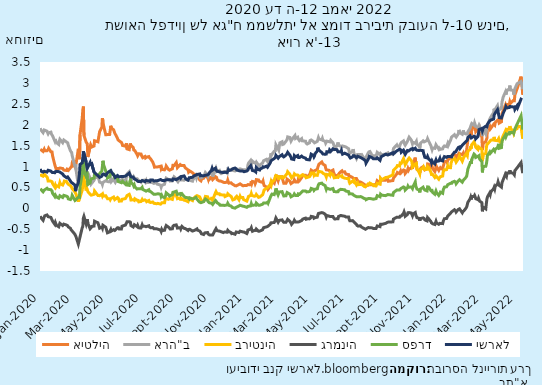
| Category | איטליה | ארה"ב | בריטניה | גרמניה | ספרד | ישראל |
|---|---|---|---|---|---|---|
| 2020-01-01 02:00:00 | 1.412 | 1.918 | 0.822 | -0.186 | 0.468 | 0.943 |
| 2020-01-02 02:00:00 | 1.413 | 1.877 | 0.793 | -0.223 | 0.445 | 0.894 |
| 2020-01-06 02:00:00 | 1.361 | 1.809 | 0.768 | -0.287 | 0.394 | 0.865 |
| 2020-01-07 02:00:00 | 1.377 | 1.818 | 0.792 | -0.285 | 0.397 | 0.881 |
| 2020-01-08 02:00:00 | 1.414 | 1.874 | 0.817 | -0.207 | 0.433 | 0.885 |
| 2020-01-09 02:00:00 | 1.378 | 1.854 | 0.82 | -0.179 | 0.451 | 0.883 |
| 2020-01-13 02:00:00 | 1.376 | 1.846 | 0.75 | -0.159 | 0.479 | 0.866 |
| 2020-01-14 02:00:00 | 1.395 | 1.811 | 0.72 | -0.171 | 0.479 | 0.876 |
| 2020-01-15 02:00:00 | 1.4 | 1.783 | 0.654 | -0.2 | 0.454 | 0.91 |
| 2020-01-16 02:00:00 | 1.436 | 1.807 | 0.643 | -0.219 | 0.467 | 0.929 |
| 2020-01-20 02:00:00 | 1.353 | 1.822 | 0.65 | -0.218 | 0.445 | 0.89 |
| 2020-01-21 02:00:00 | 1.371 | 1.774 | 0.631 | -0.248 | 0.423 | 0.869 |
| 2020-01-22 02:00:00 | 1.348 | 1.769 | 0.635 | -0.26 | 0.413 | 0.859 |
| 2020-01-23 02:00:00 | 1.254 | 1.732 | 0.591 | -0.308 | 0.358 | 0.867 |
| 2020-01-27 02:00:00 | 1.037 | 1.608 | 0.508 | -0.385 | 0.281 | 0.851 |
| 2020-01-28 02:00:00 | 1.032 | 1.656 | 0.552 | -0.341 | 0.315 | 0.876 |
| 2020-01-29 02:00:00 | 0.953 | 1.584 | 0.516 | -0.377 | 0.3 | 0.889 |
| 2020-01-30 02:00:00 | 0.942 | 1.586 | 0.542 | -0.406 | 0.271 | 0.884 |
| 2020-02-03 02:00:00 | 0.951 | 1.527 | 0.513 | -0.442 | 0.242 | 0.877 |
| 2020-02-04 02:00:00 | 0.951 | 1.599 | 0.566 | -0.399 | 0.269 | 0.872 |
| 2020-02-05 02:00:00 | 0.964 | 1.651 | 0.616 | -0.359 | 0.3 | 0.866 |
| 2020-02-06 02:00:00 | 0.964 | 1.642 | 0.582 | -0.37 | 0.295 | 0.847 |
| 2020-02-10 02:00:00 | 0.952 | 1.57 | 0.557 | -0.411 | 0.259 | 0.82 |
| 2020-02-11 02:00:00 | 0.969 | 1.601 | 0.569 | -0.391 | 0.268 | 0.797 |
| 2020-02-12 02:00:00 | 0.914 | 1.633 | 0.611 | -0.378 | 0.31 | 0.781 |
| 2020-02-13 02:00:00 | 0.907 | 1.617 | 0.652 | -0.386 | 0.299 | 0.77 |
| 2020-02-17 02:00:00 | 0.905 | 1.585 | 0.641 | -0.401 | 0.289 | 0.733 |
| 2020-02-18 02:00:00 | 0.931 | 1.561 | 0.611 | -0.407 | 0.288 | 0.749 |
| 2020-02-19 02:00:00 | 0.953 | 1.566 | 0.599 | -0.418 | 0.271 | 0.75 |
| 2020-02-20 02:00:00 | 0.906 | 1.515 | 0.576 | -0.444 | 0.226 | 0.74 |
| 2020-02-24 02:00:00 | 0.968 | 1.37 | 0.54 | -0.481 | 0.209 | 0.651 |
| 2020-02-25 02:00:00 | 0.988 | 1.352 | 0.519 | -0.512 | 0.213 | 0.627 |
| 2020-02-26 02:00:00 | 0.994 | 1.337 | 0.504 | -0.505 | 0.25 | 0.643 |
| 2020-02-27 02:00:00 | 1.075 | 1.261 | 0.47 | -0.543 | 0.31 | 0.606 |
| 2020-03-03 02:00:00 | 0.989 | 0.999 | 0.39 | -0.625 | 0.188 | 0.554 |
| 2020-03-04 02:00:00 | 1.014 | 1.052 | 0.369 | -0.638 | 0.176 | 0.41 |
| 2020-03-05 02:00:00 | 1.068 | 0.912 | 0.331 | -0.686 | 0.213 | 0.483 |
| 2020-03-09 02:00:00 | 1.424 | 0.541 | 0.159 | -0.856 | 0.264 | 0.615 |
| 2020-03-11 02:00:00 | 1.176 | 0.87 | 0.296 | -0.742 | 0.262 | 0.817 |
| 2020-03-12 02:00:00 | 1.76 | 0.804 | 0.265 | -0.741 | 0.514 | 1.048 |
| 2020-03-16 02:00:00 | 2.165 | 0.718 | 0.438 | -0.461 | 0.841 | 1.088 |
| 2020-03-17 02:00:00 | 2.355 | 1.078 | 0.554 | -0.434 | 1.033 | 1.204 |
| 2020-03-18 02:00:00 | 2.434 | 1.192 | 0.796 | -0.235 | 1.221 | 1.365 |
| 2020-03-19 02:00:00 | 1.741 | 1.14 | 0.724 | -0.193 | 0.879 | 1.341 |
| 2020-03-23 02:00:00 | 1.581 | 0.786 | 0.425 | -0.375 | 0.759 | 1.105 |
| 2020-03-24 02:00:00 | 1.565 | 0.847 | 0.479 | -0.322 | 0.881 | 1.018 |
| 2020-03-25 02:00:00 | 1.543 | 0.867 | 0.445 | -0.262 | 0.873 | 0.957 |
| 2020-03-26 02:00:00 | 1.226 | 0.845 | 0.399 | -0.361 | 0.569 | 0.959 |
| 2020-03-30 03:00:00 | 1.478 | 0.726 | 0.336 | -0.49 | 0.606 | 1.09 |
| 2020-03-31 03:00:00 | 1.523 | 0.67 | 0.356 | -0.471 | 0.677 | 1.019 |
| 2020-04-01 03:00:00 | 1.509 | 0.583 | 0.314 | -0.458 | 0.703 | 1.106 |
| 2020-04-02 03:00:00 | 1.467 | 0.597 | 0.333 | -0.433 | 0.708 | 1.089 |
| 2020-04-06 03:00:00 | 1.49 | 0.67 | 0.334 | -0.425 | 0.723 | 0.867 |
| 2020-04-07 03:00:00 | 1.616 | 0.712 | 0.414 | -0.309 | 0.818 | 0.863 |
| 2020-04-13 03:00:00 | 1.591 | 0.771 | 0.306 | -0.347 | 0.782 | 0.779 |
| 2020-04-16 03:00:00 | 1.833 | 0.627 | 0.302 | -0.474 | 0.83 | 0.739 |
| 2020-04-20 03:00:00 | 1.939 | 0.605 | 0.337 | -0.448 | 0.891 | 0.768 |
| 2020-04-21 03:00:00 | 2.156 | 0.569 | 0.297 | -0.477 | 1.004 | 0.806 |
| 2020-04-22 03:00:00 | 2.079 | 0.619 | 0.327 | -0.407 | 1.137 | 0.817 |
| 2020-04-23 03:00:00 | 1.986 | 0.602 | 0.292 | -0.424 | 1.049 | 0.818 |
| 2020-04-27 03:00:00 | 1.76 | 0.66 | 0.301 | -0.453 | 0.889 | 0.789 |
| 2020-04-30 03:00:00 | 1.763 | 0.639 | 0.231 | -0.586 | 0.723 | 0.848 |
| 2020-05-04 03:00:00 | 1.767 | 0.634 | 0.231 | -0.563 | 0.759 | 0.887 |
| 2020-05-05 03:00:00 | 1.867 | 0.662 | 0.206 | -0.578 | 0.781 | 0.878 |
| 2020-05-06 03:00:00 | 1.975 | 0.703 | 0.231 | -0.507 | 0.853 | 0.903 |
| 2020-05-07 03:00:00 | 1.919 | 0.641 | 0.235 | -0.545 | 0.821 | 0.872 |
| 2020-05-11 03:00:00 | 1.879 | 0.71 | 0.269 | -0.512 | 0.814 | 0.8 |
| 2020-05-12 03:00:00 | 1.89 | 0.665 | 0.249 | -0.505 | 0.788 | 0.792 |
| 2020-05-13 03:00:00 | 1.802 | 0.652 | 0.208 | -0.53 | 0.735 | 0.763 |
| 2020-05-14 03:00:00 | 1.817 | 0.622 | 0.204 | -0.543 | 0.747 | 0.738 |
| 2020-05-18 03:00:00 | 1.673 | 0.726 | 0.257 | -0.467 | 0.733 | 0.784 |
| 2020-05-19 03:00:00 | 1.635 | 0.688 | 0.245 | -0.464 | 0.642 | 0.783 |
| 2020-05-20 03:00:00 | 1.633 | 0.68 | 0.229 | -0.468 | 0.64 | 0.753 |
| 2020-05-21 03:00:00 | 1.614 | 0.672 | 0.171 | -0.495 | 0.633 | 0.76 |
| 2020-05-25 03:00:00 | 1.575 | 0.659 | 0.174 | -0.494 | 0.612 | 0.761 |
| 2020-05-26 03:00:00 | 1.55 | 0.696 | 0.215 | -0.429 | 0.626 | 0.748 |
| 2020-05-27 03:00:00 | 1.502 | 0.682 | 0.193 | -0.414 | 0.646 | 0.757 |
| 2020-06-01 03:00:00 | 1.487 | 0.659 | 0.231 | -0.402 | 0.577 | 0.77 |
| 2020-06-02 03:00:00 | 1.501 | 0.685 | 0.222 | -0.415 | 0.558 | 0.775 |
| 2020-06-03 03:00:00 | 1.554 | 0.746 | 0.274 | -0.354 | 0.61 | 0.788 |
| 2020-06-04 03:00:00 | 1.421 | 0.823 | 0.306 | -0.32 | 0.556 | 0.801 |
| 2020-06-08 03:00:00 | 1.404 | 0.875 | 0.334 | -0.319 | 0.548 | 0.842 |
| 2020-06-09 03:00:00 | 1.501 | 0.825 | 0.336 | -0.309 | 0.637 | 0.813 |
| 2020-06-10 03:00:00 | 1.551 | 0.726 | 0.267 | -0.331 | 0.677 | 0.795 |
| 2020-06-11 03:00:00 | 1.499 | 0.669 | 0.198 | -0.414 | 0.628 | 0.752 |
| 2020-06-15 03:00:00 | 1.458 | 0.722 | 0.205 | -0.446 | 0.561 | 0.747 |
| 2020-06-16 03:00:00 | 1.397 | 0.753 | 0.207 | -0.427 | 0.533 | 0.734 |
| 2020-06-17 03:00:00 | 1.416 | 0.738 | 0.19 | -0.392 | 0.559 | 0.706 |
| 2020-06-18 03:00:00 | 1.379 | 0.708 | 0.228 | -0.407 | 0.516 | 0.694 |
| 2020-06-22 03:00:00 | 1.288 | 0.708 | 0.193 | -0.439 | 0.461 | 0.665 |
| 2020-06-23 03:00:00 | 1.256 | 0.712 | 0.211 | -0.408 | 0.476 | 0.658 |
| 2020-06-24 03:00:00 | 1.267 | 0.679 | 0.189 | -0.44 | 0.469 | 0.639 |
| 2020-06-25 03:00:00 | 1.305 | 0.686 | 0.154 | -0.468 | 0.458 | 0.643 |
| 2020-06-29 03:00:00 | 1.298 | 0.623 | 0.163 | -0.47 | 0.47 | 0.64 |
| 2020-06-30 03:00:00 | 1.258 | 0.656 | 0.172 | -0.454 | 0.467 | 0.645 |
| 2020-07-01 03:00:00 | 1.271 | 0.676 | 0.211 | -0.395 | 0.502 | 0.664 |
| 2020-07-02 03:00:00 | 1.211 | 0.669 | 0.186 | -0.428 | 0.452 | 0.648 |
| 2020-07-06 03:00:00 | 1.24 | 0.676 | 0.201 | -0.431 | 0.425 | 0.637 |
| 2020-07-07 03:00:00 | 1.204 | 0.64 | 0.18 | -0.429 | 0.425 | 0.627 |
| 2020-07-08 03:00:00 | 1.202 | 0.664 | 0.183 | -0.44 | 0.41 | 0.666 |
| 2020-07-09 03:00:00 | 1.224 | 0.614 | 0.158 | -0.463 | 0.408 | 0.657 |
| 2020-07-13 03:00:00 | 1.237 | 0.618 | 0.186 | -0.417 | 0.444 | 0.656 |
| 2020-07-14 03:00:00 | 1.212 | 0.623 | 0.15 | -0.447 | 0.408 | 0.647 |
| 2020-07-15 03:00:00 | 1.201 | 0.63 | 0.166 | -0.444 | 0.422 | 0.644 |
| 2020-07-16 03:00:00 | 1.187 | 0.617 | 0.139 | -0.465 | 0.401 | 0.677 |
| 2020-07-20 03:00:00 | 1.104 | 0.61 | 0.151 | -0.46 | 0.356 | 0.678 |
| 2020-07-21 03:00:00 | 1.094 | 0.6 | 0.136 | -0.46 | 0.356 | 0.674 |
| 2020-07-22 03:00:00 | 1.036 | 0.597 | 0.12 | -0.49 | 0.334 | 0.653 |
| 2020-07-23 03:00:00 | 0.984 | 0.577 | 0.124 | -0.481 | 0.323 | 0.667 |
| 2020-07-27 03:00:00 | 0.988 | 0.615 | 0.109 | -0.491 | 0.34 | 0.662 |
| 2020-07-28 03:00:00 | 1.007 | 0.579 | 0.109 | -0.508 | 0.356 | 0.662 |
| 2020-07-29 03:00:00 | 0.992 | 0.574 | 0.118 | -0.498 | 0.348 | 0.662 |
| 2020-08-03 03:00:00 | 1.007 | 0.554 | 0.099 | -0.523 | 0.336 | 0.688 |
| 2020-08-04 03:00:00 | 0.947 | 0.507 | 0.077 | -0.553 | 0.283 | 0.688 |
| 2020-08-05 03:00:00 | 0.972 | 0.548 | 0.13 | -0.506 | 0.309 | 0.669 |
| 2020-08-06 03:00:00 | 0.931 | 0.536 | 0.108 | -0.531 | 0.279 | 0.67 |
| 2020-08-10 03:00:00 | 0.92 | 0.576 | 0.131 | -0.526 | 0.255 | 0.66 |
| 2020-08-11 03:00:00 | 0.943 | 0.642 | 0.2 | -0.478 | 0.279 | 0.672 |
| 2020-08-12 03:00:00 | 0.961 | 0.675 | 0.237 | -0.447 | 0.303 | 0.68 |
| 2020-08-13 03:00:00 | 1.011 | 0.721 | 0.243 | -0.412 | 0.37 | 0.662 |
| 2020-08-17 03:00:00 | 0.93 | 0.688 | 0.216 | -0.451 | 0.326 | 0.681 |
| 2020-08-18 03:00:00 | 0.926 | 0.669 | 0.219 | -0.463 | 0.31 | 0.685 |
| 2020-08-19 03:00:00 | 0.913 | 0.68 | 0.236 | -0.472 | 0.292 | 0.685 |
| 2020-08-20 03:00:00 | 0.914 | 0.651 | 0.225 | -0.496 | 0.291 | 0.688 |
| 2020-08-24 03:00:00 | 0.944 | 0.654 | 0.213 | -0.491 | 0.327 | 0.669 |
| 2020-08-25 03:00:00 | 1.026 | 0.684 | 0.263 | -0.431 | 0.382 | 0.702 |
| 2020-08-26 03:00:00 | 1.017 | 0.688 | 0.302 | -0.415 | 0.376 | 0.713 |
| 2020-08-27 03:00:00 | 1.02 | 0.752 | 0.336 | -0.407 | 0.389 | 0.7 |
| 2020-08-31 03:00:00 | 1.094 | 0.705 | 0.311 | -0.397 | 0.409 | 0.685 |
| 2020-09-01 03:00:00 | 1.035 | 0.669 | 0.295 | -0.42 | 0.398 | 0.691 |
| 2020-09-02 03:00:00 | 0.972 | 0.648 | 0.23 | -0.473 | 0.331 | 0.701 |
| 2020-09-03 03:00:00 | 0.975 | 0.635 | 0.237 | -0.488 | 0.326 | 0.722 |
| 2020-09-07 03:00:00 | 1.046 | 0.718 | 0.248 | -0.463 | 0.352 | 0.748 |
| 2020-09-08 03:00:00 | 1.028 | 0.679 | 0.188 | -0.495 | 0.326 | 0.723 |
| 2020-09-09 03:00:00 | 1.021 | 0.7 | 0.237 | -0.462 | 0.339 | 0.731 |
| 2020-09-10 03:00:00 | 1.008 | 0.677 | 0.227 | -0.433 | 0.35 | 0.763 |
| 2020-09-14 03:00:00 | 1.021 | 0.672 | 0.194 | -0.48 | 0.283 | 0.775 |
| 2020-09-15 03:00:00 | 0.998 | 0.679 | 0.217 | -0.479 | 0.271 | 0.767 |
| 2020-09-16 03:00:00 | 0.969 | 0.697 | 0.211 | -0.484 | 0.261 | 0.727 |
| 2020-09-17 03:00:00 | 0.954 | 0.689 | 0.185 | -0.491 | 0.264 | 0.702 |
| 2020-09-21 03:00:00 | 0.918 | 0.666 | 0.157 | -0.53 | 0.253 | 0.674 |
| 2020-09-22 03:00:00 | 0.866 | 0.671 | 0.203 | -0.505 | 0.235 | 0.691 |
| 2020-09-23 03:00:00 | 0.851 | 0.672 | 0.218 | -0.505 | 0.225 | 0.73 |
| 2020-09-24 03:00:00 | 0.894 | 0.666 | 0.219 | -0.501 | 0.251 | 0.746 |
| 2020-09-29 03:00:00 | 0.852 | 0.65 | 0.184 | -0.545 | 0.225 | 0.742 |
| 2020-09-30 03:00:00 | 0.866 | 0.684 | 0.229 | -0.522 | 0.248 | 0.757 |
| 2020-10-01 03:00:00 | 0.821 | 0.677 | 0.234 | -0.536 | 0.232 | 0.773 |
| 2020-10-05 03:00:00 | 0.808 | 0.782 | 0.288 | -0.51 | 0.261 | 0.793 |
| 2020-10-06 03:00:00 | 0.776 | 0.735 | 0.287 | -0.507 | 0.236 | 0.814 |
| 2020-10-07 03:00:00 | 0.785 | 0.787 | 0.303 | -0.493 | 0.242 | 0.809 |
| 2020-10-08 03:00:00 | 0.759 | 0.785 | 0.289 | -0.523 | 0.201 | 0.815 |
| 2020-10-12 03:00:00 | 0.677 | 0.774 | 0.271 | -0.545 | 0.145 | 0.821 |
| 2020-10-13 03:00:00 | 0.658 | 0.727 | 0.239 | -0.556 | 0.144 | 0.779 |
| 2020-10-14 03:00:00 | 0.657 | 0.726 | 0.22 | -0.581 | 0.135 | 0.788 |
| 2020-10-15 03:00:00 | 0.697 | 0.732 | 0.18 | -0.61 | 0.149 | 0.783 |
| 2020-10-19 03:00:00 | 0.72 | 0.769 | 0.169 | -0.628 | 0.159 | 0.775 |
| 2020-10-20 03:00:00 | 0.728 | 0.786 | 0.187 | -0.606 | 0.183 | 0.774 |
| 2020-10-21 03:00:00 | 0.782 | 0.823 | 0.242 | -0.588 | 0.204 | 0.787 |
| 2020-10-22 03:00:00 | 0.803 | 0.856 | 0.284 | -0.566 | 0.223 | 0.801 |
| 2020-10-26 02:00:00 | 0.739 | 0.801 | 0.275 | -0.58 | 0.186 | 0.8 |
| 2020-10-27 02:00:00 | 0.7 | 0.768 | 0.232 | -0.615 | 0.158 | 0.8 |
| 2020-10-28 02:00:00 | 0.765 | 0.771 | 0.213 | -0.625 | 0.178 | 0.821 |
| 2020-10-29 02:00:00 | 0.692 | 0.823 | 0.221 | -0.636 | 0.133 | 0.848 |
| 2020-11-02 02:00:00 | 0.748 | 0.843 | 0.219 | -0.64 | 0.121 | 0.914 |
| 2020-11-03 02:00:00 | 0.734 | 0.899 | 0.272 | -0.62 | 0.11 | 0.956 |
| 2020-11-04 02:00:00 | 0.687 | 0.763 | 0.207 | -0.638 | 0.092 | 0.916 |
| 2020-11-05 02:00:00 | 0.668 | 0.763 | 0.234 | -0.637 | 0.091 | 0.903 |
| 2020-11-09 02:00:00 | 0.757 | 0.924 | 0.372 | -0.509 | 0.186 | 0.961 |
| 2020-11-10 02:00:00 | 0.762 | 0.96 | 0.401 | -0.485 | 0.186 | 0.918 |
| 2020-11-11 02:00:00 | 0.738 | 0.975 | 0.413 | -0.507 | 0.157 | 0.911 |
| 2020-11-12 02:00:00 | 0.684 | 0.882 | 0.348 | -0.536 | 0.132 | 0.886 |
| 2020-11-16 02:00:00 | 0.652 | 0.906 | 0.349 | -0.545 | 0.099 | 0.875 |
| 2020-11-17 02:00:00 | 0.639 | 0.857 | 0.324 | -0.563 | 0.075 | 0.864 |
| 2020-11-18 02:00:00 | 0.655 | 0.87 | 0.337 | -0.554 | 0.081 | 0.867 |
| 2020-11-19 02:00:00 | 0.642 | 0.829 | 0.323 | -0.571 | 0.07 | 0.863 |
| 2020-11-23 02:00:00 | 0.624 | 0.854 | 0.318 | -0.581 | 0.071 | 0.855 |
| 2020-11-24 02:00:00 | 0.612 | 0.88 | 0.33 | -0.563 | 0.074 | 0.849 |
| 2020-11-25 02:00:00 | 0.615 | 0.882 | 0.318 | -0.568 | 0.069 | 0.86 |
| 2020-11-26 02:00:00 | 0.601 | 0.882 | 0.281 | -0.588 | 0.051 | 0.841 |
| 2020-11-30 02:00:00 | 0.626 | 0.839 | 0.305 | -0.571 | 0.081 | 0.859 |
| 2020-12-01 02:00:00 | 0.674 | 0.926 | 0.347 | -0.528 | 0.119 | 0.888 |
| 2020-12-02 02:00:00 | 0.632 | 0.936 | 0.354 | -0.519 | 0.103 | 0.927 |
| 2020-12-03 02:00:00 | 0.602 | 0.906 | 0.322 | -0.556 | 0.071 | 0.902 |
| 2020-12-07 02:00:00 | 0.61 | 0.923 | 0.283 | -0.582 | 0.052 | 0.917 |
| 2020-12-08 02:00:00 | 0.59 | 0.918 | 0.257 | -0.607 | 0.029 | 0.915 |
| 2020-12-09 02:00:00 | 0.582 | 0.936 | 0.261 | -0.605 | 0.021 | 0.94 |
| 2020-12-10 02:00:00 | 0.562 | 0.906 | 0.201 | -0.603 | 0.022 | 0.954 |
| 2020-12-14 02:00:00 | 0.541 | 0.893 | 0.222 | -0.62 | 0.003 | 0.964 |
| 2020-12-15 02:00:00 | 0.519 | 0.908 | 0.26 | -0.611 | -0.017 | 0.941 |
| 2020-12-16 02:00:00 | 0.536 | 0.916 | 0.272 | -0.567 | 0.023 | 0.947 |
| 2020-12-17 02:00:00 | 0.54 | 0.933 | 0.287 | -0.57 | 0.029 | 0.916 |
| 2020-12-21 02:00:00 | 0.569 | 0.935 | 0.205 | -0.58 | 0.056 | 0.899 |
| 2020-12-22 02:00:00 | 0.555 | 0.916 | 0.183 | -0.595 | 0.05 | 0.875 |
| 2020-12-23 02:00:00 | 0.585 | 0.943 | 0.286 | -0.547 | 0.074 | 0.893 |
| 2020-12-24 02:00:00 | 0.585 | 0.923 | 0.257 | -0.548 | 0.073 | 0.87 |
| 2020-12-28 02:00:00 | 0.539 | 0.923 | 0.257 | -0.565 | 0.05 | 0.89 |
| 2020-12-29 02:00:00 | 0.557 | 0.936 | 0.213 | -0.571 | 0.05 | 0.882 |
| 2020-12-30 02:00:00 | 0.543 | 0.923 | 0.213 | -0.569 | 0.047 | 0.876 |
| 2020-12-31 02:00:00 | 0.543 | 0.913 | 0.197 | -0.569 | 0.047 | 0.882 |
| 2021-01-04 02:00:00 | 0.548 | 0.913 | 0.173 | -0.604 | 0.023 | 0.892 |
| 2021-01-05 02:00:00 | 0.566 | 0.955 | 0.209 | -0.577 | 0.035 | 0.887 |
| 2021-01-06 02:00:00 | 0.567 | 1.036 | 0.243 | -0.52 | 0.046 | 0.915 |
| 2021-01-07 02:00:00 | 0.558 | 1.08 | 0.284 | -0.522 | 0.044 | 0.949 |
| 2021-01-11 02:00:00 | 0.564 | 1.146 | 0.309 | -0.496 | 0.058 | 1.019 |
| 2021-01-12 02:00:00 | 0.65 | 1.129 | 0.352 | -0.468 | 0.11 | 1.005 |
| 2021-01-13 02:00:00 | 0.6 | 1.083 | 0.307 | -0.522 | 0.069 | 0.949 |
| 2021-01-14 02:00:00 | 0.643 | 1.129 | 0.291 | -0.55 | 0.061 | 0.904 |
| 2021-01-18 02:00:00 | 0.631 | 1.084 | 0.287 | -0.527 | 0.078 | 0.892 |
| 2021-01-19 02:00:00 | 0.588 | 1.089 | 0.289 | -0.526 | 0.069 | 0.895 |
| 2021-01-20 02:00:00 | 0.619 | 1.08 | 0.301 | -0.529 | 0.075 | 0.87 |
| 2021-01-21 02:00:00 | 0.686 | 1.106 | 0.331 | -0.496 | 0.126 | 0.978 |
| 2021-01-25 02:00:00 | 0.678 | 1.03 | 0.262 | -0.55 | 0.073 | 0.924 |
| 2021-01-26 02:00:00 | 0.647 | 1.035 | 0.265 | -0.533 | 0.073 | 0.928 |
| 2021-01-27 02:00:00 | 0.655 | 1.016 | 0.269 | -0.546 | 0.074 | 0.915 |
| 2021-01-28 02:00:00 | 0.636 | 1.045 | 0.287 | -0.539 | 0.073 | 0.943 |
| 2021-02-01 02:00:00 | 0.621 | 1.079 | 0.321 | -0.516 | 0.095 | 0.968 |
| 2021-02-02 02:00:00 | 0.651 | 1.096 | 0.349 | -0.489 | 0.116 | 0.992 |
| 2021-02-03 02:00:00 | 0.587 | 1.137 | 0.371 | -0.464 | 0.127 | 0.996 |
| 2021-02-04 02:00:00 | 0.545 | 1.139 | 0.44 | -0.454 | 0.123 | 0.984 |
| 2021-02-08 02:00:00 | 0.508 | 1.17 | 0.475 | -0.445 | 0.127 | 1.007 |
| 2021-02-09 02:00:00 | 0.513 | 1.157 | 0.463 | -0.446 | 0.13 | 0.984 |
| 2021-02-10 02:00:00 | 0.504 | 1.122 | 0.489 | -0.437 | 0.147 | 0.982 |
| 2021-02-11 02:00:00 | 0.456 | 1.163 | 0.47 | -0.458 | 0.122 | 0.974 |
| 2021-02-15 02:00:00 | 0.527 | 1.208 | 0.571 | -0.381 | 0.26 | 1.09 |
| 2021-02-16 02:00:00 | 0.572 | 1.314 | 0.621 | -0.348 | 0.294 | 1.136 |
| 2021-02-17 02:00:00 | 0.586 | 1.27 | 0.572 | -0.368 | 0.288 | 1.116 |
| 2021-02-18 02:00:00 | 0.648 | 1.296 | 0.622 | -0.346 | 0.34 | 1.153 |
| 2021-02-22 02:00:00 | 0.597 | 1.365 | 0.679 | -0.339 | 0.327 | 1.191 |
| 2021-02-23 02:00:00 | 0.644 | 1.342 | 0.719 | -0.315 | 0.364 | 1.203 |
| 2021-02-24 02:00:00 | 0.687 | 1.376 | 0.732 | -0.304 | 0.391 | 1.215 |
| 2021-02-25 02:00:00 | 0.799 | 1.52 | 0.784 | -0.232 | 0.476 | 1.269 |
| 2021-03-01 02:00:00 | 0.658 | 1.417 | 0.759 | -0.334 | 0.324 | 1.201 |
| 2021-03-02 02:00:00 | 0.675 | 1.391 | 0.687 | -0.352 | 0.32 | 1.185 |
| 2021-03-03 02:00:00 | 0.755 | 1.481 | 0.779 | -0.288 | 0.39 | 1.237 |
| 2021-03-04 02:00:00 | 0.74 | 1.564 | 0.731 | -0.311 | 0.379 | 1.233 |
| 2021-03-08 02:00:00 | 0.756 | 1.591 | 0.754 | -0.277 | 0.399 | 1.281 |
| 2021-03-09 02:00:00 | 0.692 | 1.526 | 0.727 | -0.301 | 0.363 | 1.251 |
| 2021-03-10 02:00:00 | 0.675 | 1.518 | 0.714 | -0.313 | 0.352 | 1.234 |
| 2021-03-11 02:00:00 | 0.601 | 1.537 | 0.735 | -0.334 | 0.296 | 1.23 |
| 2021-03-15 02:00:00 | 0.599 | 1.606 | 0.798 | -0.334 | 0.299 | 1.272 |
| 2021-03-16 02:00:00 | 0.626 | 1.618 | 0.785 | -0.336 | 0.314 | 1.269 |
| 2021-03-17 02:00:00 | 0.697 | 1.643 | 0.83 | -0.291 | 0.377 | 1.31 |
| 2021-03-18 02:00:00 | 0.689 | 1.708 | 0.875 | -0.264 | 0.375 | 1.339 |
| 2021-03-22 02:00:00 | 0.647 | 1.695 | 0.814 | -0.311 | 0.338 | 1.271 |
| 2021-03-24 02:00:00 | 0.591 | 1.608 | 0.758 | -0.353 | 0.275 | 1.221 |
| 2021-03-25 02:00:00 | 0.58 | 1.633 | 0.729 | -0.384 | 0.262 | 1.18 |
| 2021-03-29 03:00:00 | 0.639 | 1.708 | 0.788 | -0.318 | 0.313 | 1.168 |
| 2021-03-30 03:00:00 | 0.68 | 1.703 | 0.824 | -0.286 | 0.343 | 1.258 |
| 2021-03-31 03:00:00 | 0.668 | 1.74 | 0.845 | -0.292 | 0.337 | 1.236 |
| 2021-04-01 03:00:00 | 0.631 | 1.67 | 0.795 | -0.328 | 0.308 | 1.23 |
| 2021-04-05 03:00:00 | 0.631 | 1.7 | 0.795 | -0.328 | 0.308 | 1.261 |
| 2021-04-06 03:00:00 | 0.693 | 1.656 | 0.797 | -0.316 | 0.345 | 1.217 |
| 2021-04-07 03:00:00 | 0.693 | 1.674 | 0.773 | -0.324 | 0.342 | 1.214 |
| 2021-04-08 03:00:00 | 0.662 | 1.619 | 0.749 | -0.336 | 0.334 | 1.214 |
| 2021-04-12 03:00:00 | 0.735 | 1.666 | 0.789 | -0.293 | 0.389 | 1.25 |
| 2021-04-13 03:00:00 | 0.749 | 1.614 | 0.779 | -0.292 | 0.387 | 1.229 |
| 2021-04-14 03:00:00 | 0.793 | 1.632 | 0.804 | -0.258 | 0.416 | 1.224 |
| 2021-04-19 03:00:00 | 0.791 | 1.605 | 0.755 | -0.235 | 0.415 | 1.199 |
| 2021-04-20 03:00:00 | 0.779 | 1.559 | 0.731 | -0.262 | 0.404 | 1.174 |
| 2021-04-21 03:00:00 | 0.753 | 1.556 | 0.74 | -0.262 | 0.392 | 1.169 |
| 2021-04-22 03:00:00 | 0.755 | 1.538 | 0.74 | -0.252 | 0.393 | 1.166 |
| 2021-04-26 03:00:00 | 0.799 | 1.567 | 0.756 | -0.253 | 0.401 | 1.159 |
| 2021-04-27 03:00:00 | 0.821 | 1.622 | 0.774 | -0.249 | 0.416 | 1.19 |
| 2021-04-28 03:00:00 | 0.871 | 1.609 | 0.797 | -0.231 | 0.433 | 1.235 |
| 2021-04-29 03:00:00 | 0.913 | 1.634 | 0.843 | -0.193 | 0.475 | 1.294 |
| 2021-05-03 03:00:00 | 0.874 | 1.598 | 0.842 | -0.204 | 0.456 | 1.265 |
| 2021-05-04 03:00:00 | 0.861 | 1.592 | 0.795 | -0.238 | 0.428 | 1.23 |
| 2021-05-05 03:00:00 | 0.898 | 1.566 | 0.819 | -0.228 | 0.451 | 1.256 |
| 2021-05-06 03:00:00 | 0.917 | 1.57 | 0.792 | -0.225 | 0.457 | 1.307 |
| 2021-05-10 03:00:00 | 0.928 | 1.602 | 0.788 | -0.212 | 0.467 | 1.371 |
| 2021-05-11 03:00:00 | 0.986 | 1.622 | 0.833 | -0.161 | 0.521 | 1.451 |
| 2021-05-12 03:00:00 | 1.024 | 1.692 | 0.886 | -0.123 | 0.562 | 1.403 |
| 2021-05-13 03:00:00 | 1.057 | 1.657 | 0.898 | -0.12 | 0.586 | 1.395 |
| 2021-05-18 03:00:00 | 1.108 | 1.637 | 0.868 | -0.103 | 0.602 | 1.334 |
| 2021-05-19 03:00:00 | 1.118 | 1.671 | 0.848 | -0.11 | 0.608 | 1.324 |
| 2021-05-20 03:00:00 | 1.058 | 1.625 | 0.839 | -0.109 | 0.572 | 1.299 |
| 2021-05-24 03:00:00 | 1.024 | 1.601 | 0.811 | -0.14 | 0.543 | 1.293 |
| 2021-05-25 03:00:00 | 0.959 | 1.559 | 0.786 | -0.167 | 0.493 | 1.282 |
| 2021-05-26 03:00:00 | 0.921 | 1.576 | 0.752 | -0.206 | 0.452 | 1.297 |
| 2021-05-27 03:00:00 | 0.936 | 1.606 | 0.81 | -0.172 | 0.484 | 1.354 |
| 2021-05-31 03:00:00 | 0.909 | 1.594 | 0.795 | -0.187 | 0.463 | 1.347 |
| 2021-06-01 03:00:00 | 0.901 | 1.606 | 0.826 | -0.178 | 0.469 | 1.396 |
| 2021-06-02 03:00:00 | 0.878 | 1.588 | 0.799 | -0.198 | 0.454 | 1.377 |
| 2021-06-03 03:00:00 | 0.898 | 1.625 | 0.841 | -0.183 | 0.47 | 1.363 |
| 2021-06-07 03:00:00 | 0.914 | 1.569 | 0.806 | -0.198 | 0.473 | 1.422 |
| 2021-06-08 03:00:00 | 0.861 | 1.533 | 0.77 | -0.224 | 0.431 | 1.434 |
| 2021-06-09 03:00:00 | 0.829 | 1.491 | 0.73 | -0.244 | 0.402 | 1.407 |
| 2021-06-10 03:00:00 | 0.795 | 1.432 | 0.747 | -0.256 | 0.388 | 1.431 |
| 2021-06-14 03:00:00 | 0.779 | 1.494 | 0.741 | -0.251 | 0.393 | 1.403 |
| 2021-06-15 03:00:00 | 0.788 | 1.492 | 0.758 | -0.232 | 0.409 | 1.403 |
| 2021-06-16 03:00:00 | 0.778 | 1.575 | 0.739 | -0.25 | 0.397 | 1.35 |
| 2021-06-17 03:00:00 | 0.819 | 1.504 | 0.776 | -0.195 | 0.427 | 1.357 |
| 2021-06-21 03:00:00 | 0.876 | 1.489 | 0.769 | -0.171 | 0.454 | 1.351 |
| 2021-06-22 03:00:00 | 0.898 | 1.463 | 0.78 | -0.164 | 0.461 | 1.382 |
| 2021-06-23 03:00:00 | 0.895 | 1.485 | 0.78 | -0.178 | 0.45 | 1.322 |
| 2021-06-24 03:00:00 | 0.865 | 1.492 | 0.741 | -0.188 | 0.43 | 1.293 |
| 2021-06-28 03:00:00 | 0.873 | 1.476 | 0.722 | -0.19 | 0.442 | 1.319 |
| 2021-06-29 03:00:00 | 0.88 | 1.47 | 0.738 | -0.17 | 0.457 | 1.318 |
| 2021-06-30 03:00:00 | 0.819 | 1.468 | 0.716 | -0.207 | 0.412 | 1.304 |
| 2021-07-01 03:00:00 | 0.803 | 1.458 | 0.73 | -0.201 | 0.398 | 1.292 |
| 2021-07-05 03:00:00 | 0.805 | 1.424 | 0.714 | -0.21 | 0.398 | 1.272 |
| 2021-07-06 03:00:00 | 0.744 | 1.348 | 0.634 | -0.268 | 0.344 | 1.241 |
| 2021-07-07 03:00:00 | 0.741 | 1.316 | 0.6 | -0.298 | 0.33 | 1.236 |
| 2021-07-08 03:00:00 | 0.763 | 1.293 | 0.612 | -0.307 | 0.348 | 1.203 |
| 2021-07-12 03:00:00 | 0.738 | 1.364 | 0.651 | -0.295 | 0.341 | 1.231 |
| 2021-07-13 03:00:00 | 0.715 | 1.417 | 0.632 | -0.294 | 0.322 | 1.258 |
| 2021-07-14 03:00:00 | 0.71 | 1.346 | 0.627 | -0.319 | 0.313 | 1.268 |
| 2021-07-15 03:00:00 | 0.72 | 1.299 | 0.664 | -0.334 | 0.307 | 1.258 |
| 2021-07-19 03:00:00 | 0.713 | 1.189 | 0.56 | -0.386 | 0.277 | 1.212 |
| 2021-07-20 03:00:00 | 0.686 | 1.222 | 0.564 | -0.41 | 0.261 | 1.192 |
| 2021-07-21 03:00:00 | 0.688 | 1.288 | 0.603 | -0.395 | 0.275 | 1.244 |
| 2021-07-22 03:00:00 | 0.637 | 1.278 | 0.566 | -0.426 | 0.286 | 1.227 |
| 2021-07-26 03:00:00 | 0.629 | 1.29 | 0.571 | -0.418 | 0.28 | 1.217 |
| 2021-07-27 03:00:00 | 0.623 | 1.241 | 0.558 | -0.441 | 0.272 | 1.217 |
| 2021-07-28 03:00:00 | 0.616 | 1.233 | 0.575 | -0.45 | 0.273 | 1.203 |
| 2021-07-29 03:00:00 | 0.625 | 1.269 | 0.573 | -0.45 | 0.273 | 1.201 |
| 2021-08-02 03:00:00 | 0.571 | 1.177 | 0.521 | -0.487 | 0.233 | 1.162 |
| 2021-08-03 03:00:00 | 0.566 | 1.172 | 0.52 | -0.482 | 0.233 | 1.162 |
| 2021-08-04 03:00:00 | 0.553 | 1.182 | 0.512 | -0.501 | 0.23 | 1.136 |
| 2021-08-05 03:00:00 | 0.53 | 1.224 | 0.524 | -0.498 | 0.205 | 1.079 |
| 2021-08-09 03:00:00 | 0.552 | 1.324 | 0.584 | -0.46 | 0.234 | 1.174 |
| 2021-08-10 03:00:00 | 0.549 | 1.349 | 0.589 | -0.457 | 0.229 | 1.202 |
| 2021-08-11 03:00:00 | 0.567 | 1.33 | 0.571 | -0.464 | 0.237 | 1.243 |
| 2021-08-12 03:00:00 | 0.544 | 1.359 | 0.601 | -0.46 | 0.222 | 1.241 |
| 2021-08-16 03:00:00 | 0.565 | 1.265 | 0.573 | -0.469 | 0.224 | 1.21 |
| 2021-08-17 03:00:00 | 0.573 | 1.262 | 0.562 | -0.471 | 0.229 | 1.209 |
| 2021-08-18 03:00:00 | 0.551 | 1.258 | 0.565 | -0.482 | 0.218 | 1.184 |
| 2021-08-19 03:00:00 | 0.562 | 1.243 | 0.538 | -0.489 | 0.219 | 1.169 |
| 2021-08-23 03:00:00 | 0.581 | 1.252 | 0.535 | -0.481 | 0.231 | 1.183 |
| 2021-08-24 03:00:00 | 0.57 | 1.294 | 0.538 | -0.478 | 0.235 | 1.189 |
| 2021-08-25 03:00:00 | 0.662 | 1.339 | 0.597 | -0.422 | 0.303 | 1.207 |
| 2021-08-26 03:00:00 | 0.67 | 1.349 | 0.6 | -0.407 | 0.314 | 1.187 |
| 2021-08-30 03:00:00 | 0.61 | 1.278 | 0.578 | -0.439 | 0.276 | 1.147 |
| 2021-08-31 03:00:00 | 0.709 | 1.309 | 0.714 | -0.383 | 0.338 | 1.155 |
| 2021-09-01 03:00:00 | 0.691 | 1.294 | 0.693 | -0.373 | 0.337 | 1.233 |
| 2021-09-02 03:00:00 | 0.669 | 1.284 | 0.681 | -0.385 | 0.314 | 1.239 |
| 2021-09-09 03:00:00 | 0.67 | 1.297 | 0.736 | -0.361 | 0.303 | 1.293 |
| 2021-09-13 03:00:00 | 0.686 | 1.326 | 0.745 | -0.331 | 0.329 | 1.276 |
| 2021-09-14 03:00:00 | 0.647 | 1.284 | 0.738 | -0.34 | 0.306 | 1.266 |
| 2021-09-22 03:00:00 | 0.664 | 1.301 | 0.799 | -0.324 | 0.312 | 1.33 |
| 2021-09-23 03:00:00 | 0.721 | 1.43 | 0.907 | -0.258 | 0.375 | 1.302 |
| 2021-09-29 03:00:00 | 0.824 | 1.517 | 0.991 | -0.213 | 0.438 | 1.374 |
| 2021-09-30 03:00:00 | 0.858 | 1.487 | 1.022 | -0.199 | 0.459 | 1.389 |
| 2021-10-04 03:00:00 | 0.83 | 1.479 | 1.011 | -0.214 | 0.436 | 1.413 |
| 2021-10-05 03:00:00 | 0.86 | 1.526 | 1.084 | -0.188 | 0.459 | 1.407 |
| 2021-10-06 03:00:00 | 0.892 | 1.521 | 1.071 | -0.182 | 0.47 | 1.399 |
| 2021-10-07 03:00:00 | 0.856 | 1.573 | 1.077 | -0.185 | 0.462 | 1.34 |
| 2021-10-11 03:00:00 | 0.916 | 1.612 | 1.188 | -0.121 | 0.511 | 1.392 |
| 2021-10-12 03:00:00 | 0.926 | 1.577 | 1.148 | -0.086 | 0.533 | 1.368 |
| 2021-10-13 03:00:00 | 0.904 | 1.537 | 1.089 | -0.127 | 0.494 | 1.316 |
| 2021-10-14 03:00:00 | 0.833 | 1.511 | 1.042 | -0.191 | 0.436 | 1.29 |
| 2021-10-18 03:00:00 | 0.9 | 1.6 | 1.136 | -0.148 | 0.488 | 1.382 |
| 2021-10-19 03:00:00 | 0.948 | 1.637 | 1.169 | -0.106 | 0.528 | 1.386 |
| 2021-10-20 03:00:00 | 0.914 | 1.657 | 1.148 | -0.126 | 0.504 | 1.371 |
| 2021-10-21 03:00:00 | 0.941 | 1.701 | 1.202 | -0.102 | 0.524 | 1.394 |
| 2021-10-25 03:00:00 | 0.965 | 1.631 | 1.14 | -0.114 | 0.51 | 1.421 |
| 2021-10-26 03:00:00 | 0.996 | 1.608 | 1.11 | -0.117 | 0.523 | 1.44 |
| 2021-10-27 03:00:00 | 0.944 | 1.541 | 0.986 | -0.178 | 0.471 | 1.43 |
| 2021-10-28 03:00:00 | 1.052 | 1.58 | 1.009 | -0.136 | 0.516 | 1.402 |
| 2021-11-01 02:00:00 | 1.213 | 1.556 | 1.062 | -0.102 | 0.631 | 1.436 |
| 2021-11-02 02:00:00 | 1.073 | 1.549 | 1.039 | -0.165 | 0.531 | 1.406 |
| 2021-11-03 02:00:00 | 1.048 | 1.603 | 1.075 | -0.168 | 0.521 | 1.424 |
| 2021-11-04 02:00:00 | 0.933 | 1.526 | 0.944 | -0.224 | 0.46 | 1.388 |
| 2021-11-08 02:00:00 | 0.894 | 1.49 | 0.856 | -0.243 | 0.432 | 1.384 |
| 2021-11-09 02:00:00 | 0.841 | 1.436 | 0.824 | -0.298 | 0.38 | 1.36 |
| 2021-11-10 02:00:00 | 0.936 | 1.549 | 0.925 | -0.247 | 0.459 | 1.388 |
| 2021-11-11 02:00:00 | 0.962 | 1.549 | 0.92 | -0.231 | 0.47 | 1.411 |
| 2021-11-15 02:00:00 | 0.995 | 1.614 | 0.964 | -0.229 | 0.505 | 1.379 |
| 2021-11-16 02:00:00 | 0.97 | 1.634 | 0.991 | -0.242 | 0.476 | 1.311 |
| 2021-11-17 02:00:00 | 0.975 | 1.589 | 0.963 | -0.246 | 0.486 | 1.273 |
| 2021-11-18 02:00:00 | 0.92 | 1.586 | 0.925 | -0.275 | 0.437 | 1.22 |
| 2021-11-22 02:00:00 | 0.956 | 1.624 | 0.933 | -0.301 | 0.417 | 1.206 |
| 2021-11-23 02:00:00 | 1.061 | 1.665 | 0.997 | -0.22 | 0.512 | 1.239 |
| 2021-11-24 02:00:00 | 1.074 | 1.634 | 0.996 | -0.228 | 0.523 | 1.24 |
| 2021-11-25 02:00:00 | 1.055 | 1.634 | 0.969 | -0.251 | 0.508 | 1.177 |
| 2021-11-29 02:00:00 | 0.977 | 1.499 | 0.861 | -0.317 | 0.422 | 1.128 |
| 2021-11-30 02:00:00 | 0.969 | 1.444 | 0.809 | -0.349 | 0.399 | 1.088 |
| 2021-12-01 02:00:00 | 1.01 | 1.404 | 0.82 | -0.343 | 0.427 | 1.132 |
| 2021-12-02 02:00:00 | 0.954 | 1.444 | 0.811 | -0.369 | 0.38 | 1.106 |
| 2021-12-06 02:00:00 | 0.879 | 1.434 | 0.738 | -0.388 | 0.336 | 1.062 |
| 2021-12-07 02:00:00 | 0.921 | 1.473 | 0.73 | -0.375 | 0.334 | 1.124 |
| 2021-12-08 02:00:00 | 1.026 | 1.521 | 0.775 | -0.313 | 0.413 | 1.158 |
| 2021-12-09 02:00:00 | 0.996 | 1.499 | 0.755 | -0.353 | 0.378 | 1.121 |
| 2021-12-13 02:00:00 | 0.908 | 1.416 | 0.697 | -0.382 | 0.309 | 1.132 |
| 2021-12-14 02:00:00 | 0.934 | 1.441 | 0.724 | -0.369 | 0.331 | 1.154 |
| 2021-12-15 02:00:00 | 0.919 | 1.456 | 0.736 | -0.36 | 0.349 | 1.194 |
| 2021-12-16 02:00:00 | 0.974 | 1.411 | 0.757 | -0.348 | 0.387 | 1.149 |
| 2021-12-20 02:00:00 | 0.93 | 1.422 | 0.772 | -0.366 | 0.36 | 1.134 |
| 2021-12-21 02:00:00 | 1.006 | 1.462 | 0.873 | -0.306 | 0.442 | 1.186 |
| 2021-12-22 02:00:00 | 1.05 | 1.452 | 0.886 | -0.293 | 0.46 | 1.201 |
| 2021-12-23 02:00:00 | 1.113 | 1.493 | 0.922 | -0.249 | 0.507 | 1.237 |
| 2021-12-27 02:00:00 | 1.123 | 1.476 | 0.925 | -0.243 | 0.515 | 1.219 |
| 2021-12-28 02:00:00 | 1.096 | 1.481 | 0.925 | -0.236 | 0.51 | 1.202 |
| 2021-12-29 02:00:00 | 1.156 | 1.55 | 1.013 | -0.184 | 0.564 | 1.242 |
| 2021-12-30 02:00:00 | 1.172 | 1.508 | 0.977 | -0.177 | 0.565 | 1.246 |
| 2022-01-03 02:00:00 | 1.206 | 1.628 | 0.971 | -0.118 | 0.597 | 1.238 |
| 2022-01-04 02:00:00 | 1.215 | 1.647 | 1.085 | -0.122 | 0.59 | 1.231 |
| 2022-01-05 02:00:00 | 1.235 | 1.705 | 1.087 | -0.084 | 0.598 | 1.23 |
| 2022-01-06 02:00:00 | 1.273 | 1.721 | 1.156 | -0.061 | 0.623 | 1.267 |
| 2022-01-10 02:00:00 | 1.286 | 1.76 | 1.19 | -0.034 | 0.646 | 1.343 |
| 2022-01-11 02:00:00 | 1.307 | 1.736 | 1.17 | -0.027 | 0.652 | 1.35 |
| 2022-01-12 02:00:00 | 1.263 | 1.743 | 1.14 | -0.059 | 0.627 | 1.349 |
| 2022-01-13 02:00:00 | 1.217 | 1.704 | 1.105 | -0.09 | 0.587 | 1.353 |
| 2022-01-17 02:00:00 | 1.293 | 1.784 | 1.186 | -0.025 | 0.658 | 1.456 |
| 2022-01-18 02:00:00 | 1.317 | 1.874 | 1.217 | -0.018 | 0.671 | 1.47 |
| 2022-01-19 02:00:00 | 1.339 | 1.865 | 1.256 | -0.012 | 0.685 | 1.467 |
| 2022-01-20 02:00:00 | 1.302 | 1.804 | 1.225 | -0.024 | 0.663 | 1.433 |
| 2022-01-24 02:00:00 | 1.284 | 1.771 | 1.126 | -0.107 | 0.625 | 1.508 |
| 2022-01-25 02:00:00 | 1.289 | 1.769 | 1.164 | -0.08 | 0.648 | 1.518 |
| 2022-01-26 02:00:00 | 1.328 | 1.864 | 1.198 | -0.074 | 0.672 | 1.537 |
| 2022-01-27 02:00:00 | 1.286 | 1.799 | 1.228 | -0.059 | 0.669 | 1.556 |
| 2022-01-31 02:00:00 | 1.294 | 1.777 | 1.302 | 0.011 | 0.746 | 1.6 |
| 2022-02-01 02:00:00 | 1.413 | 1.788 | 1.3 | 0.037 | 0.777 | 1.616 |
| 2022-02-02 02:00:00 | 1.43 | 1.775 | 1.257 | 0.04 | 0.784 | 1.629 |
| 2022-02-03 02:00:00 | 1.643 | 1.831 | 1.368 | 0.143 | 0.939 | 1.696 |
| 2022-02-07 02:00:00 | 1.781 | 1.916 | 1.408 | 0.228 | 1.078 | 1.735 |
| 2022-02-08 02:00:00 | 1.847 | 1.963 | 1.489 | 0.265 | 1.125 | 1.71 |
| 2022-02-09 02:00:00 | 1.751 | 1.942 | 1.43 | 0.212 | 1.064 | 1.683 |
| 2022-02-10 02:00:00 | 1.891 | 2.029 | 1.524 | 0.284 | 1.171 | 1.701 |
| 2022-02-14 02:00:00 | 1.971 | 1.988 | 1.589 | 0.283 | 1.297 | 1.725 |
| 2022-02-15 02:00:00 | 1.957 | 2.043 | 1.582 | 0.308 | 1.306 | 1.71 |
| 2022-02-16 02:00:00 | 1.91 | 2.038 | 1.524 | 0.276 | 1.272 | 1.711 |
| 2022-02-17 02:00:00 | 1.835 | 1.962 | 1.463 | 0.231 | 1.217 | 1.661 |
| 2022-02-21 02:00:00 | 1.911 | 1.929 | 1.408 | 0.206 | 1.243 | 1.717 |
| 2022-02-22 02:00:00 | 1.924 | 1.939 | 1.471 | 0.243 | 1.263 | 1.792 |
| 2022-02-23 02:00:00 | 1.941 | 1.991 | 1.479 | 0.228 | 1.261 | 1.885 |
| 2022-02-24 02:00:00 | 1.817 | 1.963 | 1.447 | 0.172 | 1.179 | 1.883 |
| 2022-02-28 02:00:00 | 1.706 | 1.825 | 1.41 | 0.135 | 1.115 | 1.909 |
| 2022-03-01 02:00:00 | 1.402 | 1.728 | 1.128 | -0.072 | 0.859 | 1.855 |
| 2022-03-02 02:00:00 | 1.554 | 1.877 | 1.259 | 0.027 | 0.998 | 1.876 |
| 2022-03-03 02:00:00 | 1.571 | 1.84 | 1.299 | 0.02 | 1.002 | 1.928 |
| 2022-03-07 02:00:00 | 1.594 | 1.773 | 1.304 | -0.015 | 1.005 | 1.966 |
| 2022-03-08 02:00:00 | 1.596 | 1.846 | 1.446 | 0.112 | 1.054 | 1.967 |
| 2022-03-09 02:00:00 | 1.679 | 1.953 | 1.526 | 0.216 | 1.143 | 1.954 |
| 2022-03-10 02:00:00 | 1.903 | 1.986 | 1.523 | 0.274 | 1.267 | 2.012 |
| 2022-03-14 02:00:00 | 1.962 | 2.133 | 1.594 | 0.368 | 1.347 | 2.091 |
| 2022-03-15 02:00:00 | 1.898 | 2.144 | 1.576 | 0.332 | 1.315 | 2.074 |
| 2022-03-16 02:00:00 | 1.895 | 2.185 | 1.63 | 0.392 | 1.336 | 2.111 |
| 2022-03-21 02:00:00 | 2.009 | 2.29 | 1.638 | 0.47 | 1.41 | 2.136 |
| 2022-03-22 02:00:00 | 2.022 | 2.382 | 1.708 | 0.505 | 1.42 | 2.23 |
| 2022-03-23 02:00:00 | 1.984 | 2.292 | 1.627 | 0.466 | 1.37 | 2.208 |
| 2022-03-24 02:00:00 | 2.053 | 2.372 | 1.646 | 0.532 | 1.413 | 2.282 |
| 2022-03-28 03:00:00 | 2.106 | 2.458 | 1.617 | 0.578 | 1.452 | 2.361 |
| 2022-03-29 03:00:00 | 2.115 | 2.394 | 1.642 | 0.633 | 1.497 | 2.309 |
| 2022-03-30 03:00:00 | 2.128 | 2.349 | 1.666 | 0.646 | 1.542 | 2.24 |
| 2022-03-31 03:00:00 | 2.039 | 2.338 | 1.61 | 0.548 | 1.436 | 2.17 |
| 2022-04-04 03:00:00 | 2.07 | 2.395 | 1.547 | 0.506 | 1.452 | 2.16 |
| 2022-04-05 03:00:00 | 2.262 | 2.547 | 1.654 | 0.614 | 1.6 | 2.196 |
| 2022-04-06 03:00:00 | 2.3 | 2.598 | 1.703 | 0.647 | 1.637 | 2.231 |
| 2022-04-07 03:00:00 | 2.334 | 2.658 | 1.73 | 0.681 | 1.664 | 2.272 |
| 2022-04-11 03:00:00 | 2.465 | 2.78 | 1.847 | 0.816 | 1.753 | 2.389 |
| 2022-04-12 03:00:00 | 2.409 | 2.721 | 1.803 | 0.79 | 1.712 | 2.431 |
| 2022-04-13 03:00:00 | 2.373 | 2.699 | 1.799 | 0.766 | 1.702 | 2.405 |
| 2022-04-14 03:00:00 | 2.482 | 2.828 | 1.889 | 0.842 | 1.78 | 2.415 |
| 2022-04-18 03:00:00 | 2.482 | 2.853 | 1.889 | 0.842 | 1.78 | 2.41 |
| 2022-04-19 03:00:00 | 2.546 | 2.936 | 1.967 | 0.91 | 1.844 | 2.435 |
| 2022-04-20 03:00:00 | 2.508 | 2.832 | 1.915 | 0.857 | 1.801 | 2.425 |
| 2022-04-25 03:00:00 | 2.576 | 2.82 | 1.841 | 0.837 | 1.824 | 2.425 |
| 2022-04-26 03:00:00 | 2.555 | 2.72 | 1.796 | 0.815 | 1.799 | 2.409 |
| 2022-04-27 03:00:00 | 2.573 | 2.832 | 1.812 | 0.801 | 1.793 | 2.427 |
| 2022-04-28 03:00:00 | 2.712 | 2.822 | 1.877 | 0.9 | 1.901 | 2.365 |
| 2022-05-02 03:00:00 | 2.86 | 2.981 | 1.905 | 0.968 | 2.014 | 2.453 |
| 2022-05-03 03:00:00 | 2.882 | 2.971 | 1.958 | 0.965 | 2.024 | 2.412 |
| 2022-05-09 03:00:00 | 3.15 | 3.034 | 1.956 | 1.095 | 2.214 | 2.61 |
| 2022-05-10 03:00:00 | 3.001 | 2.991 | 1.848 | 1 | 2.102 | 2.598 |
| 2022-05-11 03:00:00 | 2.895 | 2.921 | 1.826 | 0.986 | 2.028 | 2.595 |
| 2022-05-12 03:00:00 | 2.712 | 2.848 | 1.661 | 0.84 | 1.879 | 2.586 |